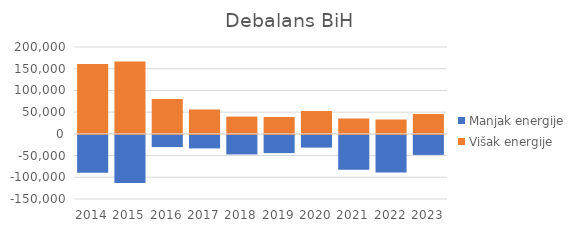
| Category | Manjak energije | Višak energije |
|---|---|---|
| 2014.0 | -87222 | 160838.806 |
| 2015.0 | -110950 | 166862.633 |
| 2016.0 | -28159 | 80310.449 |
| 2017.0 | -31199.606 | 56105.485 |
| 2018.0 | -45061.892 | 39814.041 |
| 2019.0 | -42009.929 | 38864.148 |
| 2020.0 | -29318.468 | 52586.78 |
| 2021.0 | -80435.232 | 35417.218 |
| 2022.0 | -86765.32 | 33013.971 |
| 2023.0 | -46142.329 | 45671.701 |